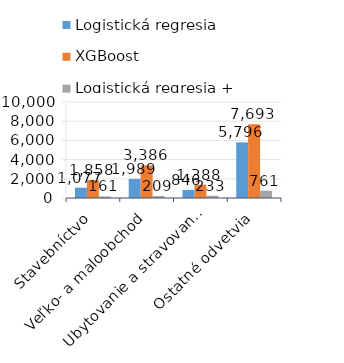
| Category | Logistická regresia | XGBoost | Logistická regresia + XGBoost |
|---|---|---|---|
| Stavebníctvo | 1077 | 1858 | 161 |
| Veľko- a maloobchod | 1989 | 3386 | 209 |
| Ubytovanie a stravovanie | 846 | 1388 | 233 |
| Ostatné odvetvia | 5796 | 7693 | 761 |